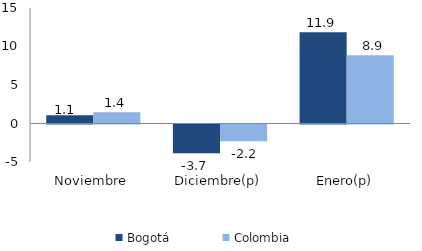
| Category | Bogotá | Colombia |
|---|---|---|
| Noviembre | 1.078 | 1.446 |
| Diciembre(p) | -3.718 | -2.167 |
| Enero(p) | 11.855 | 8.856 |